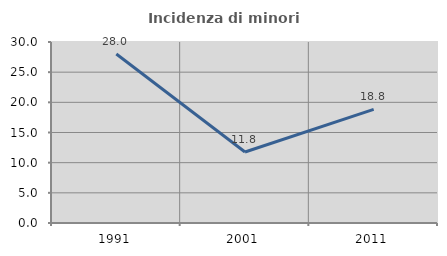
| Category | Incidenza di minori stranieri |
|---|---|
| 1991.0 | 28 |
| 2001.0 | 11.765 |
| 2011.0 | 18.824 |